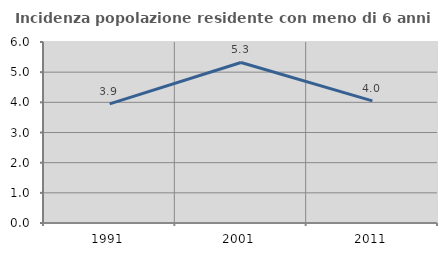
| Category | Incidenza popolazione residente con meno di 6 anni |
|---|---|
| 1991.0 | 3.947 |
| 2001.0 | 5.322 |
| 2011.0 | 4.05 |